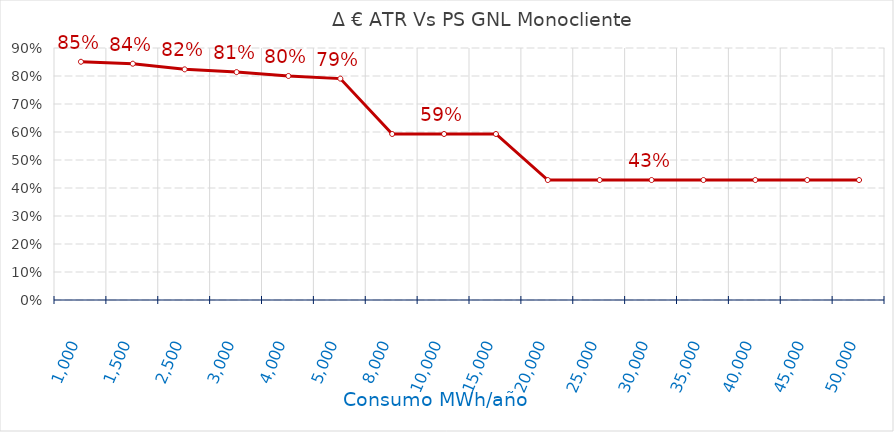
| Category | D €/año |
|---|---|
| 1000.0 | 0.851 |
| 1500.0 | 0.844 |
| 2500.0 | 0.824 |
| 3000.0 | 0.814 |
| 4000.0 | 0.8 |
| 5000.0 | 0.791 |
| 8000.0 | 0.593 |
| 10000.0 | 0.593 |
| 15000.0 | 0.593 |
| 20000.0 | 0.428 |
| 25000.0 | 0.428 |
| 30000.0 | 0.428 |
| 35000.0 | 0.428 |
| 40000.0 | 0.428 |
| 45000.0 | 0.428 |
| 50000.0 | 0.428 |